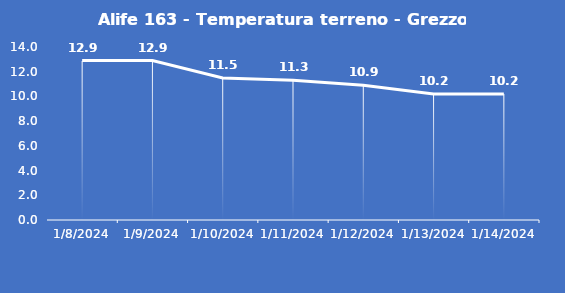
| Category | Alife 163 - Temperatura terreno - Grezzo (°C) |
|---|---|
| 1/8/24 | 12.9 |
| 1/9/24 | 12.9 |
| 1/10/24 | 11.5 |
| 1/11/24 | 11.3 |
| 1/12/24 | 10.9 |
| 1/13/24 | 10.2 |
| 1/14/24 | 10.2 |